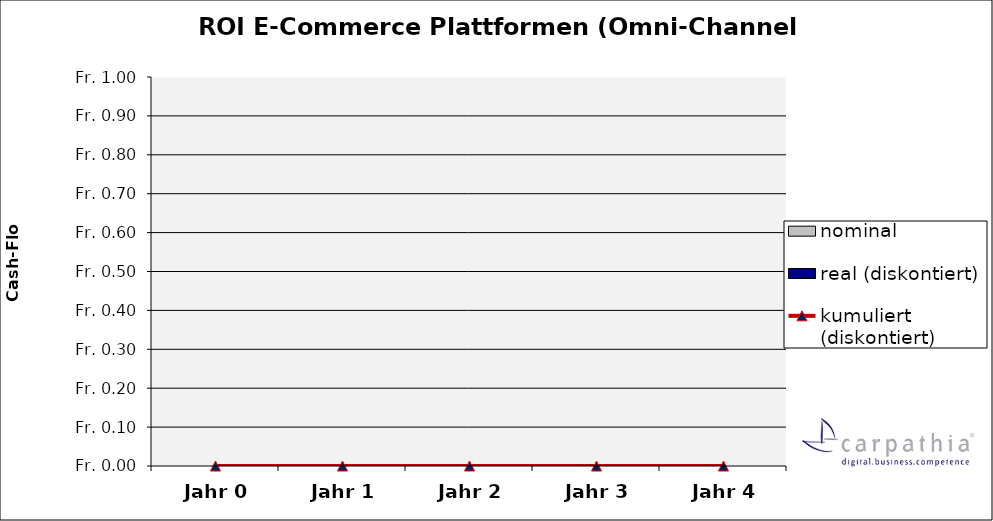
| Category | nominal | real (diskontiert) |
|---|---|---|
| Jahr 0 | 0 | 0 |
| Jahr 1 | 0 | 0 |
| Jahr 2 | 0 | 0 |
| Jahr 3 | 0 | 0 |
| Jahr 4 | 0 | 0 |